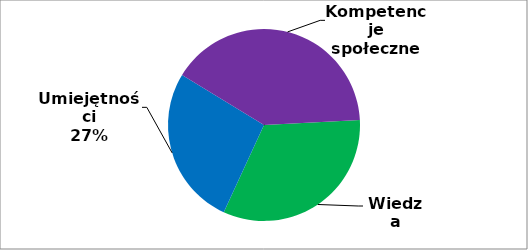
| Category | Series 0 |
|---|---|
| 0 | 89 |
| 1 | 73 |
| 2 | 110 |